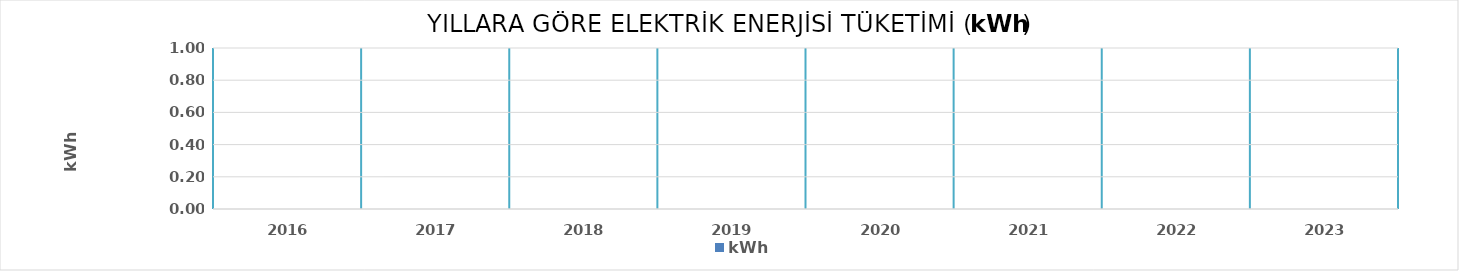
| Category | kWh |
|---|---|
| 2016.0 | 0 |
| 2017.0 | 0 |
| 2018.0 | 0 |
| 2019.0 | 0 |
| 2020.0 | 0 |
| 2021.0 | 0 |
| 2022.0 | 0 |
| 2023.0 | 0 |